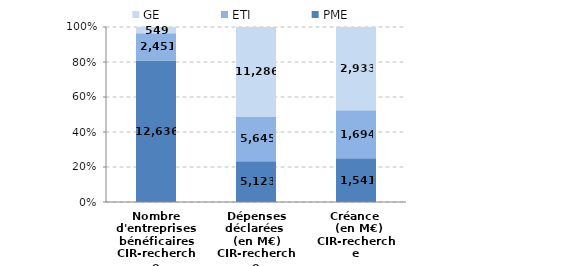
| Category | PME | ETI | GE |
|---|---|---|---|
| Nombre d'entreprises bénéficaires
CIR-recherche | 12636 | 2451 | 549 |
| Dépenses déclarées 
(en M€)
CIR-recherche | 5123.4 | 5644.6 | 11286.1 |
| Créance 
 (en M€)
CIR-recherche | 1541.1 | 1694.3 | 2932.9 |